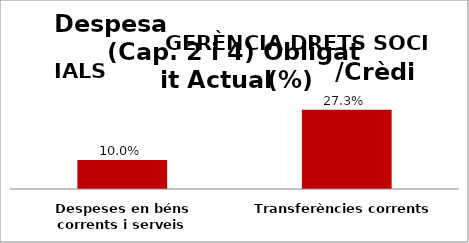
| Category | Series 0 |
|---|---|
| Despeses en béns corrents i serveis | 0.1 |
| Transferències corrents | 0.273 |